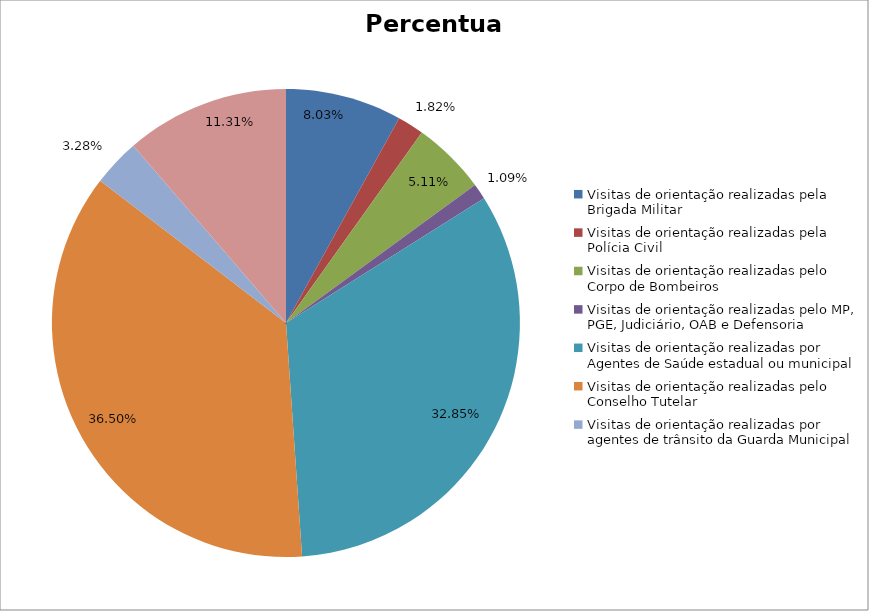
| Category | Percentual |
|---|---|
| Visitas de orientação realizadas pela Brigada Militar | 0.08 |
| Visitas de orientação realizadas pela Polícia Civil | 0.018 |
| Visitas de orientação realizadas pelo Corpo de Bombeiros | 0.051 |
| Visitas de orientação realizadas pelo MP, PGE, Judiciário, OAB e Defensoria | 0.011 |
| Visitas de orientação realizadas por Agentes de Saúde estadual ou municipal | 0.328 |
| Visitas de orientação realizadas pelo Conselho Tutelar | 0.365 |
| Visitas de orientação realizadas por agentes de trânsito da Guarda Municipal | 0.033 |
| Visitas de orientação realizadas por ONGs, entidades privadas, CRAS e CREAS | 0.113 |